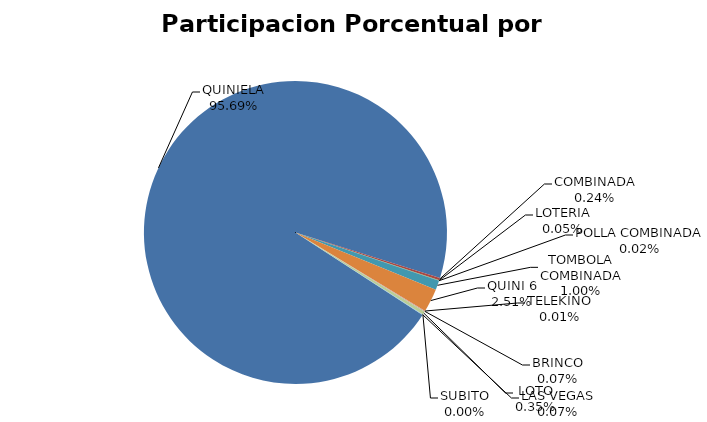
| Category | Series 0 |
|---|---|
| QUINIELA | 70475817.274 |
| COMBINADA | 178930.09 |
| LOTERIA | 36115.72 |
| POLLA COMBINADA | 16904.25 |
| TOMBOLA COMBINADA | 732677 |
| QUINI 6 | 1844185.11 |
| TELEKINO | 8050 |
| BRINCO | 53335.92 |
| LOTO | 258065 |
| SUBITO | 0 |
| LAS VEGAS | 48576 |